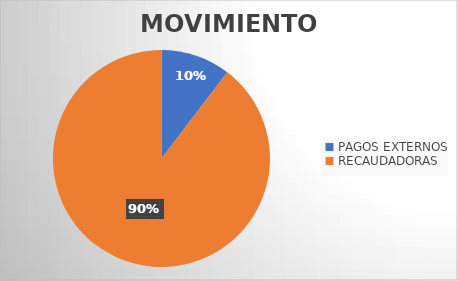
| Category | MOVIMIENTOS |
|---|---|
| PAGOS EXTERNOS | 2016 |
| RECAUDADORAS | 17416 |